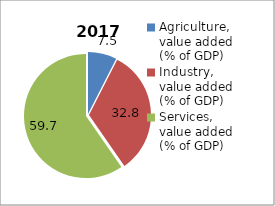
| Category | 2017 |
|---|---|
| Agriculture, value added (% of GDP)  | 7.51 |
| Industry, value added (% of GDP) | 32.819 |
| Services, value added (% of GDP) | 59.671 |